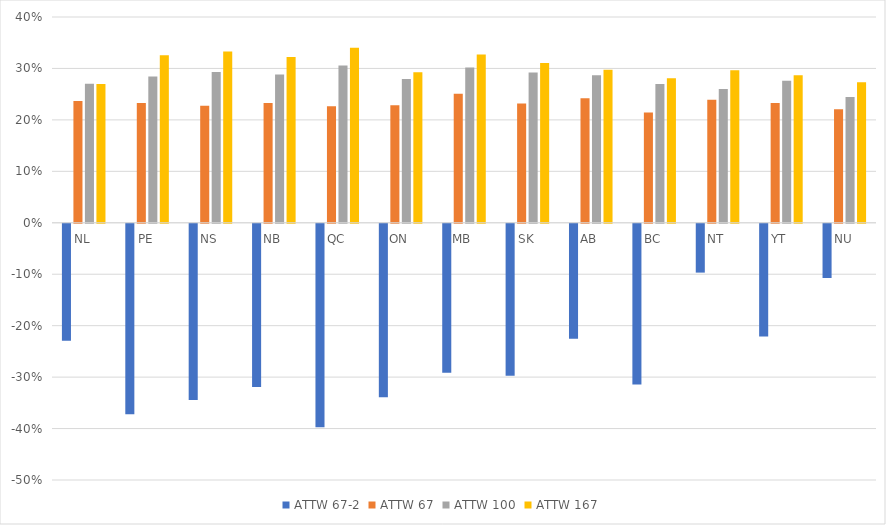
| Category | ATTW 67-2 | ATTW 67 | ATTW 100 | ATTW 167 |
|---|---|---|---|---|
| NL | -0.227 | 0.237 | 0.27 | 0.27 |
| PE | -0.37 | 0.233 | 0.284 | 0.326 |
| NS | -0.343 | 0.227 | 0.293 | 0.333 |
| NB | -0.317 | 0.233 | 0.288 | 0.322 |
| QC | -0.395 | 0.227 | 0.306 | 0.34 |
| ON | -0.337 | 0.229 | 0.279 | 0.293 |
| MB | -0.29 | 0.251 | 0.302 | 0.327 |
| SK | -0.295 | 0.232 | 0.292 | 0.311 |
| AB | -0.223 | 0.242 | 0.287 | 0.297 |
| BC | -0.312 | 0.214 | 0.27 | 0.281 |
| NT | -0.095 | 0.239 | 0.26 | 0.297 |
| YT | -0.219 | 0.233 | 0.276 | 0.287 |
| NU | -0.105 | 0.221 | 0.245 | 0.273 |